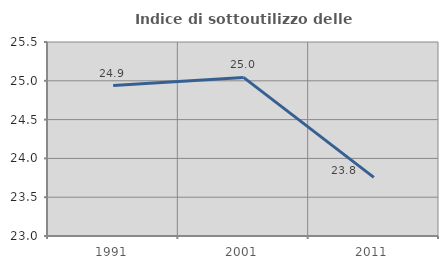
| Category | Indice di sottoutilizzo delle abitazioni  |
|---|---|
| 1991.0 | 24.939 |
| 2001.0 | 25.044 |
| 2011.0 | 23.756 |